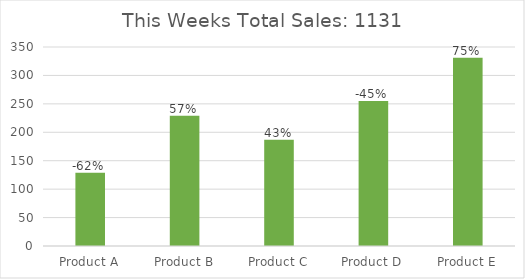
| Category | This Week |
|---|---|
| Product A | 129 |
| Product B | 229 |
| Product C | 187 |
| Product D | 255 |
| Product E | 331 |